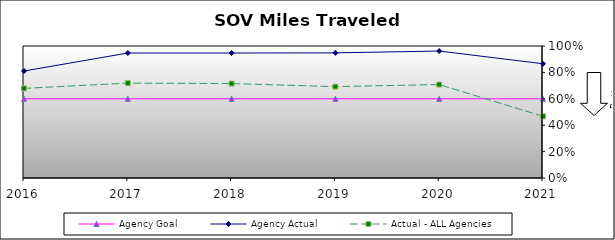
| Category | Agency Goal | Agency Actual | Actual - ALL Agencies |
|---|---|---|---|
| 2016.0 | 0.6 | 0.811 | 0.679 |
| 2017.0 | 0.6 | 0.947 | 0.719 |
| 2018.0 | 0.6 | 0.947 | 0.715 |
| 2019.0 | 0.6 | 0.948 | 0.692 |
| 2020.0 | 0.6 | 0.962 | 0.708 |
| 2021.0 | 0.6 | 0.866 | 0.467 |